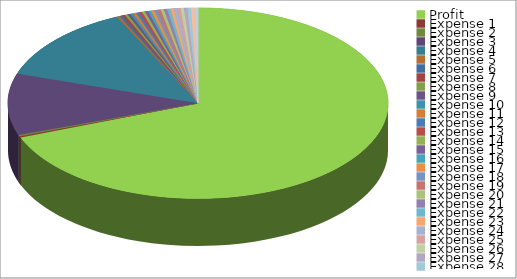
| Category | Series 0 |
|---|---|
| Profit | 0.691 |
| Expense 1 | 0.002 |
| Expense 2 | 0.002 |
| Expense 3 | 0.104 |
| Expense 4 | 0.13 |
| Expense 5 | 0.002 |
| Expense 6 | 0.002 |
| Expense 7 | 0.002 |
| Expense 8 | 0.002 |
| Expense 9 | 0.002 |
| Expense 10 | 0.003 |
| Expense 11 | 0.003 |
| Expense 12 | 0.003 |
| Expense 13 | 0.003 |
| Expense 14 | 0.003 |
| Expense 15 | 0.003 |
| Expense 16 | 0.003 |
| Expense 17 | 0.003 |
| Expense 18 | 0.003 |
| Expense 19 | 0.003 |
| Expense 20 | 0.003 |
| Expense 21 | 0.003 |
| Expense 22 | 0.003 |
| Expense 23 | 0.003 |
| Expense 24 | 0.003 |
| Expense 25 | 0.003 |
| Expense 26 | 0.003 |
| Expense 27 | 0.003 |
| Expense 28 | 0.003 |
| Expense 29 | 0.003 |
| Expense 30 | 0.003 |